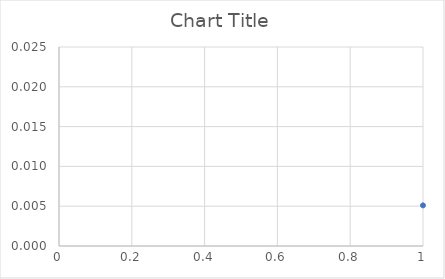
| Category | Series 0 |
|---|---|
| 0 | 0.005 |
| 1 | 0.005 |
| 2 | 0.006 |
| 3 | 0.005 |
| 4 | 0.008 |
| 5 | 0.005 |
| 6 | 0.006 |
| 7 | 0.005 |
| 8 | 0.006 |
| 9 | 0.005 |
| 10 | 0.006 |
| 11 | 0.005 |
| 12 | 0.005 |
| 13 | 0.004 |
| 14 | 0.005 |
| 15 | 0.004 |
| 16 | 0.005 |
| 17 | 0.004 |
| 18 | 0.005 |
| 19 | 0.005 |
| 20 | 0.004 |
| 21 | 0.005 |
| 22 | 0.005 |
| 23 | 0.004 |
| 24 | 0.005 |
| 25 | 0.005 |
| 26 | 0.004 |
| 27 | 0.004 |
| 28 | 0.004 |
| 29 | 0.004 |
| 30 | 0.005 |
| 31 | 0.005 |
| 32 | 0.006 |
| 33 | 0.005 |
| 34 | 0.004 |
| 35 | 0.004 |
| 36 | 0.005 |
| 37 | 0.004 |
| 38 | 0.005 |
| 39 | 0.004 |
| 40 | 0.011 |
| 41 | 0.011 |
| 42 | 0.011 |
| 43 | 0.009 |
| 44 | 0.011 |
| 45 | 0.008 |
| 46 | 0.007 |
| 47 | 0.008 |
| 48 | 0.011 |
| 49 | 0.01 |
| 50 | 0 |
| 51 | 0.022 |
| 52 | 0.007 |
| 53 | 0.005 |
| 54 | 0.005 |
| 55 | 0.007 |
| 56 | 0.006 |
| 57 | 0.006 |
| 58 | 0.007 |
| 59 | 0.007 |
| 60 | 0.005 |
| 61 | 0.006 |
| 62 | 0.006 |
| 63 | 0.02 |
| 64 | 0 |
| 65 | 0.013 |
| 66 | 0.017 |
| 67 | 0.018 |
| 68 | 0.017 |
| 69 | 0.016 |
| 70 | 0.014 |
| 71 | 0.013 |
| 72 | 0.014 |
| 73 | 0.017 |
| 74 | 0.016 |
| 75 | 0.015 |
| 76 | 0.013 |
| 77 | 0.012 |
| 78 | 0.012 |
| 79 | 0.012 |
| 80 | 0 |
| 81 | 0.005 |
| 82 | 0.003 |
| 83 | 0.004 |
| 84 | 0.003 |
| 85 | 0.005 |
| 86 | 0.005 |
| 87 | 0.006 |
| 88 | 0.005 |
| 89 | 0.004 |
| 90 | 0.005 |
| 91 | 0.004 |
| 92 | 0.004 |
| 93 | 0.004 |
| 94 | 0.004 |
| 95 | 0.004 |
| 96 | 0.004 |
| 97 | 0.004 |
| 98 | 0.003 |
| 99 | 0.005 |
| 100 | 0.004 |
| 101 | 0.004 |
| 102 | 0.005 |
| 103 | 0.003 |
| 104 | 0.004 |
| 105 | 0.005 |
| 106 | 0.005 |
| 107 | 0.004 |
| 108 | 0.004 |
| 109 | 0.004 |
| 110 | 0.003 |
| 111 | 0.004 |
| 112 | 0.003 |
| 113 | 0.004 |
| 114 | 0.003 |
| 115 | 0.004 |
| 116 | 0.003 |
| 117 | 0.003 |
| 118 | 0.003 |
| 119 | 0.003 |
| 120 | 0.004 |
| 121 | 0.009 |
| 122 | 0.007 |
| 123 | 0.007 |
| 124 | 0.007 |
| 125 | 0.009 |
| 126 | 0.008 |
| 127 | 0.009 |
| 128 | 0.011 |
| 129 | 0.01 |
| 130 | 0.007 |
| 131 | 0 |
| 132 | 0.005 |
| 133 | 0.006 |
| 134 | 0.007 |
| 135 | 0.009 |
| 136 | 0.008 |
| 137 | 0.008 |
| 138 | 0.01 |
| 139 | 0.011 |
| 140 | 0.008 |
| 141 | 0.01 |
| 142 | 0.008 |
| 143 | 0.008 |
| 144 | 0.01 |
| 145 | 0.009 |
| 146 | 0.008 |
| 147 | 0.006 |
| 148 | 0.008 |
| 149 | 0.008 |
| 150 | 0.007 |
| 151 | 0.008 |
| 152 | 0.008 |
| 153 | 0.009 |
| 154 | 0.007 |
| 155 | 0.011 |
| 156 | 0.008 |
| 157 | 0.008 |
| 158 | 0.013 |
| 159 | 0.008 |
| 160 | 0.009 |
| 161 | 0.009 |
| 162 | 0 |
| 163 | 0.01 |
| 164 | 0.011 |
| 165 | 0.01 |
| 166 | 0.012 |
| 167 | 0.015 |
| 168 | 0.015 |
| 169 | 0.014 |
| 170 | 0.015 |
| 171 | 0.017 |
| 172 | 0.016 |
| 173 | 0.016 |
| 174 | 0.015 |
| 175 | 0.015 |
| 176 | 0.015 |
| 177 | 0.013 |
| 178 | 0.015 |
| 179 | 0.016 |
| 180 | 0.013 |
| 181 | 0.013 |
| 182 | 0.017 |
| 183 | 0.017 |
| 184 | 0.013 |
| 185 | 0.013 |
| 186 | 0.014 |
| 187 | 0.016 |
| 188 | 0.015 |
| 189 | 0.012 |
| 190 | 0.018 |
| 191 | 0.015 |
| 192 | 0.014 |
| 193 | 0.015 |
| 194 | 0.016 |
| 195 | 0.016 |
| 196 | 0.016 |
| 197 | 0.015 |
| 198 | 0.02 |
| 199 | 0.014 |
| 200 | 0.019 |
| 201 | 0.02 |
| 202 | 0.018 |
| 203 | 0.016 |
| 204 | 0.016 |
| 205 | 0.02 |
| 206 | 0.016 |
| 207 | 0.014 |
| 208 | 0.014 |
| 209 | 0.013 |
| 210 | 0.016 |
| 211 | 0.015 |
| 212 | 0 |
| 213 | 0.007 |
| 214 | 0.007 |
| 215 | 0.007 |
| 216 | 0.009 |
| 217 | 0.007 |
| 218 | 0.007 |
| 219 | 0.007 |
| 220 | 0.005 |
| 221 | 0.005 |
| 222 | 0.005 |
| 223 | 0.008 |
| 224 | 0.007 |
| 225 | 0.005 |
| 226 | 0.007 |
| 227 | 0.006 |
| 228 | 0 |
| 229 | 0.004 |
| 230 | 0.004 |
| 231 | 0.004 |
| 232 | 0.005 |
| 233 | 0.005 |
| 234 | 0.005 |
| 235 | 0.005 |
| 236 | 0.004 |
| 237 | 0.005 |
| 238 | 0.005 |
| 239 | 0.005 |
| 240 | 0.006 |
| 241 | 0.006 |
| 242 | 0.005 |
| 243 | 0.005 |
| 244 | 0.005 |
| 245 | 0.005 |
| 246 | 0.005 |
| 247 | 0.005 |
| 248 | 0.005 |
| 249 | 0.005 |
| 250 | 0.006 |
| 251 | 0.005 |
| 252 | 0.005 |
| 253 | 0.005 |
| 254 | 0.005 |
| 255 | 0.006 |
| 256 | 0.006 |
| 257 | 0.005 |
| 258 | 0.005 |
| 259 | 0.006 |
| 260 | 0.005 |
| 261 | 0.004 |
| 262 | 0.005 |
| 263 | 0.005 |
| 264 | 0.005 |
| 265 | 0.006 |
| 266 | 0.006 |
| 267 | 0.004 |
| 268 | 0.007 |
| 269 | 0 |
| 270 | 0.007 |
| 271 | 0.003 |
| 272 | 0.004 |
| 273 | 0.004 |
| 274 | 0.005 |
| 275 | 0.004 |
| 276 | 0.004 |
| 277 | 0.005 |
| 278 | 0.005 |
| 279 | 0.005 |
| 280 | 0.004 |
| 281 | 0.005 |
| 282 | 0.005 |
| 283 | 0.005 |
| 284 | 0.005 |
| 285 | 0.005 |
| 286 | 0.004 |
| 287 | 0.005 |
| 288 | 0.005 |
| 289 | 0.005 |
| 290 | 0.004 |
| 291 | 0.004 |
| 292 | 0.005 |
| 293 | 0.006 |
| 294 | 0.005 |
| 295 | 0.004 |
| 296 | 0.004 |
| 297 | 0.004 |
| 298 | 0.006 |
| 299 | 0.005 |
| 300 | 0.007 |
| 301 | 0.004 |
| 302 | 0.006 |
| 303 | 0.006 |
| 304 | 0.004 |
| 305 | 0.005 |
| 306 | 0.006 |
| 307 | 0.006 |
| 308 | 0.005 |
| 309 | 0.004 |
| 310 | 0 |
| 311 | 0.008 |
| 312 | 0.009 |
| 313 | 0.007 |
| 314 | 0.008 |
| 315 | 0.008 |
| 316 | 0.009 |
| 317 | 0.007 |
| 318 | 0.008 |
| 319 | 0.009 |
| 320 | 0.007 |
| 321 | 0 |
| 322 | 0.004 |
| 323 | 0.005 |
| 324 | 0.005 |
| 325 | 0.005 |
| 326 | 0.005 |
| 327 | 0.006 |
| 328 | 0.005 |
| 329 | 0.006 |
| 330 | 0.006 |
| 331 | 0.005 |
| 332 | 0.005 |
| 333 | 0.005 |
| 334 | 0.007 |
| 335 | 0.007 |
| 336 | 0.005 |
| 337 | 0.005 |
| 338 | 0.007 |
| 339 | 0.005 |
| 340 | 0.006 |
| 341 | 0.005 |
| 342 | 0 |
| 343 | 0.008 |
| 344 | 0.007 |
| 345 | 0.007 |
| 346 | 0.004 |
| 347 | 0.005 |
| 348 | 0.004 |
| 349 | 0.005 |
| 350 | 0.005 |
| 351 | 0.004 |
| 352 | 0.004 |
| 353 | 0.005 |
| 354 | 0.004 |
| 355 | 0.005 |
| 356 | 0.005 |
| 357 | 0.004 |
| 358 | 0.005 |
| 359 | 0.005 |
| 360 | 0.005 |
| 361 | 0.005 |
| 362 | 0.005 |
| 363 | 0.006 |
| 364 | 0.005 |
| 365 | 0.006 |
| 366 | 0.005 |
| 367 | 0.004 |
| 368 | 0.004 |
| 369 | 0.005 |
| 370 | 0.005 |
| 371 | 0.004 |
| 372 | 0.006 |
| 373 | 0 |
| 374 | 0.006 |
| 375 | 0.008 |
| 376 | 0.007 |
| 377 | 0.008 |
| 378 | 0.009 |
| 379 | 0.009 |
| 380 | 0.008 |
| 381 | 0.008 |
| 382 | 0.007 |
| 383 | 0.008 |
| 384 | 0.007 |
| 385 | 0.007 |
| 386 | 0.007 |
| 387 | 0.009 |
| 388 | 0.007 |
| 389 | 0.007 |
| 390 | 0.009 |
| 391 | 0.008 |
| 392 | 0.007 |
| 393 | 0.008 |
| 394 | 0.011 |
| 395 | 0.013 |
| 396 | 0.011 |
| 397 | 0.013 |
| 398 | 0.011 |
| 399 | 0.012 |
| 400 | 0.011 |
| 401 | 0.011 |
| 402 | 0.01 |
| 403 | 0.011 |
| 404 | 0.013 |
| 405 | 0.013 |
| 406 | 0.012 |
| 407 | 0.01 |
| 408 | 0.013 |
| 409 | 0 |
| 410 | 0.011 |
| 411 | 0.012 |
| 412 | 0.014 |
| 413 | 0.014 |
| 414 | 0.011 |
| 415 | 0.014 |
| 416 | 0.014 |
| 417 | 0.013 |
| 418 | 0.013 |
| 419 | 0.015 |
| 420 | 0.013 |
| 421 | 0.014 |
| 422 | 0.01 |
| 423 | 0.01 |
| 424 | 0.014 |
| 425 | 0.012 |
| 426 | 0.014 |
| 427 | 0.011 |
| 428 | 0.013 |
| 429 | 0.011 |
| 430 | 0.01 |
| 431 | 0.012 |
| 432 | 0.017 |
| 433 | 0.01 |
| 434 | 0.011 |
| 435 | 0.016 |
| 436 | 0.016 |
| 437 | 0 |
| 438 | 0.013 |
| 439 | 0.012 |
| 440 | 0.012 |
| 441 | 0.014 |
| 442 | 0.017 |
| 443 | 0.012 |
| 444 | 0.015 |
| 445 | 0.013 |
| 446 | 0.012 |
| 447 | 0.01 |
| 448 | 0.017 |
| 449 | 0.01 |
| 450 | 0.013 |
| 451 | 0.014 |
| 452 | 0.014 |
| 453 | 0.01 |
| 454 | 0.011 |
| 455 | 0.011 |
| 456 | 0.011 |
| 457 | 0.01 |
| 458 | 0.014 |
| 459 | 0.015 |
| 460 | 0.013 |
| 461 | 0.013 |
| 462 | 0.005 |
| 463 | 0.008 |
| 464 | 0.015 |
| 465 | 0.014 |
| 466 | 0.016 |
| 467 | 0.012 |
| 468 | 0 |
| 469 | 0.01 |
| 470 | 0.011 |
| 471 | 0.01 |
| 472 | 0.012 |
| 473 | 0.013 |
| 474 | 0.011 |
| 475 | 0.013 |
| 476 | 0.013 |
| 477 | 0.01 |
| 478 | 0.009 |
| 479 | 0.013 |
| 480 | 0.009 |
| 481 | 0.01 |
| 482 | 0.011 |
| 483 | 0.013 |
| 484 | 0.014 |
| 485 | 0.01 |
| 486 | 0.01 |
| 487 | 0.011 |
| 488 | 0.014 |
| 489 | 0.014 |
| 490 | 0.014 |
| 491 | 0.011 |
| 492 | 0.013 |
| 493 | 0.01 |
| 494 | 0.009 |
| 495 | 0.015 |